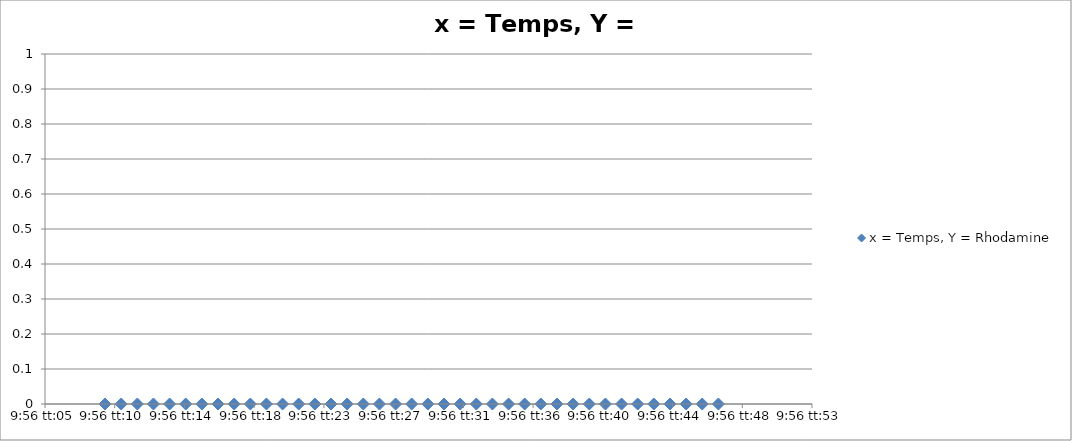
| Category | x = Temps, Y = Rhodamine |
|---|---|
| 0.41399305555555554 | 0 |
| 0.41400462962962964 | 0 |
| 0.4140162037037037 | 0 |
| 0.41402777777777783 | 0 |
| 0.41403935185185187 | 0 |
| 0.41405092592592596 | 0 |
| 0.4140625 | 0 |
| 0.41407407407407404 | 0 |
| 0.41408564814814813 | 0 |
| 0.41409722222222217 | 0 |
| 0.4141087962962963 | 0 |
| 0.41412037037037036 | 0 |
| 0.41413194444444446 | 0 |
| 0.4141435185185185 | 0 |
| 0.4141550925925926 | 0 |
| 0.4141666666666666 | 0 |
| 0.4141782407407408 | 0 |
| 0.4141898148148148 | 0 |
| 0.4142013888888889 | 0 |
| 0.41421296296296295 | 0 |
| 0.41422453703703704 | 0 |
| 0.4142361111111111 | 0 |
| 0.41424768518518523 | 0 |
| 0.41425925925925927 | 0 |
| 0.41427083333333337 | 0 |
| 0.4142824074074074 | 0 |
| 0.4142939814814815 | 0 |
| 0.41430555555555554 | 0 |
| 0.4143171296296296 | 0 |
| 0.4143287037037037 | 0 |
| 0.41434027777777777 | 0 |
| 0.41435185185185186 | 0 |
| 0.4143634259259259 | 0 |
| 0.414375 | 0 |
| 0.41438657407407403 | 0 |
| 0.4143981481481482 | 0 |
| 0.4144097222222222 | 0 |
| 0.4144212962962963 | 0 |
| 0.41443287037037035 | 0 |